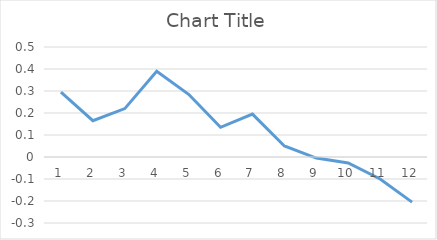
| Category | Series 0 |
|---|---|
| 0 | 0.295 |
| 1 | 0.165 |
| 2 | 0.22 |
| 3 | 0.39 |
| 4 | 0.285 |
| 5 | 0.135 |
| 6 | 0.195 |
| 7 | 0.05 |
| 8 | -0.005 |
| 9 | -0.027 |
| 10 | -0.1 |
| 11 | -0.205 |